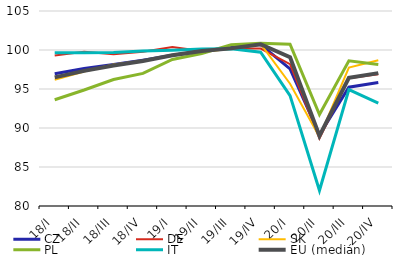
| Category | CZ | DE | SK | PL | IT | EU (medián) |
|---|---|---|---|---|---|---|
| 18/I | 96.956 | 99.305 | 96.193 | 93.623 | 99.632 | 96.495 |
| 18/II | 97.625 | 99.773 | 97.237 | 94.874 | 99.662 | 97.326 |
| 18/III | 98.145 | 99.445 | 98.15 | 96.221 | 99.665 | 98.011 |
| 18/IV | 98.699 | 99.782 | 98.62 | 97 | 99.857 | 98.598 |
| 19/I | 99.326 | 100.393 | 99.327 | 98.791 | 99.976 | 99.321 |
| 19/II | 99.857 | 99.888 | 99.728 | 99.55 | 100.116 | 99.871 |
| 19/III | 100.323 | 100.197 | 100.154 | 100.665 | 100.148 | 100.208 |
| 19/IV | 100.708 | 100.178 | 100.791 | 100.867 | 99.711 | 100.739 |
| 20/I | 97.584 | 98.179 | 95.679 | 100.742 | 94.146 | 99.086 |
| 20/II | 89.114 | 88.658 | 88.863 | 91.732 | 81.982 | 88.988 |
| 20/III | 95.225 | 96.372 | 97.752 | 98.623 | 94.929 | 96.434 |
| 20/IV | 95.824 | 96.887 | 98.689 | 98.141 | 93.178 | 97.033 |